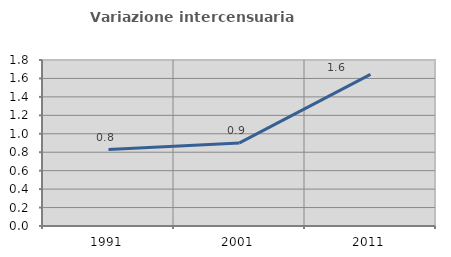
| Category | Variazione intercensuaria annua |
|---|---|
| 1991.0 | 0.829 |
| 2001.0 | 0.901 |
| 2011.0 | 1.644 |